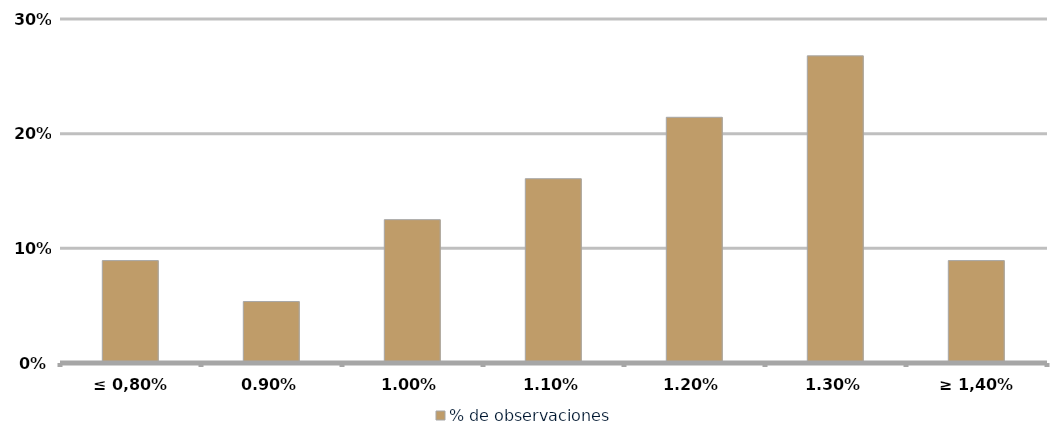
| Category | % de observaciones  |
|---|---|
| ≤ 0,80% | 0.089 |
| 0,90% | 0.054 |
| 1,00% | 0.125 |
| 1,10% | 0.161 |
| 1,20% | 0.214 |
| 1,30% | 0.268 |
| ≥ 1,40% | 0.089 |